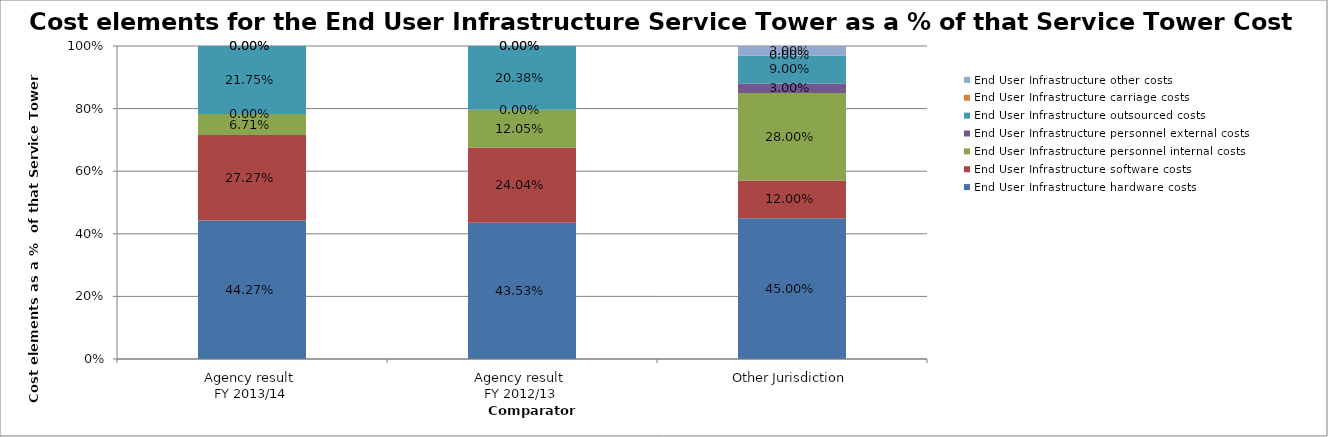
| Category | End User Infrastructure hardware costs | End User Infrastructure software costs | End User Infrastructure personnel internal costs | End User Infrastructure personnel external costs | End User Infrastructure outsourced costs | End User Infrastructure carriage costs | End User Infrastructure other costs |
|---|---|---|---|---|---|---|---|
| Agency result 
FY 2013/14 | 0.443 | 0.273 | 0.067 | 0 | 0.218 | 0 | 0 |
| Agency result 
FY 2012/13 | 0.435 | 0.24 | 0.12 | 0 | 0.204 | 0 | 0 |
| Other Jurisdiction | 0.45 | 0.12 | 0.28 | 0.03 | 0.09 | 0 | 0.03 |